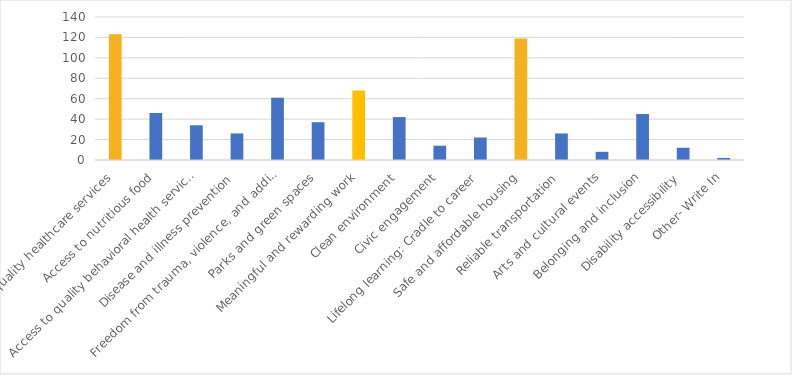
| Category | Number of Responses |
|---|---|
| Access to quality healthcare services | 123 |
| Access to nutritious food | 46 |
| Access to quality behavioral health services | 34 |
| Disease and illness prevention | 26 |
| Freedom from trauma, violence, and addiction | 61 |
| Parks and green spaces | 37 |
| Meaningful and rewarding work | 68 |
| Clean environment | 42 |
| Civic engagement | 14 |
| Lifelong learning: Cradle to career | 22 |
| Safe and affordable housing | 119 |
| Reliable transportation | 26 |
| Arts and cultural events | 8 |
| Belonging and inclusion | 45 |
| Disability accessibility | 12 |
| Other- Write In | 2 |